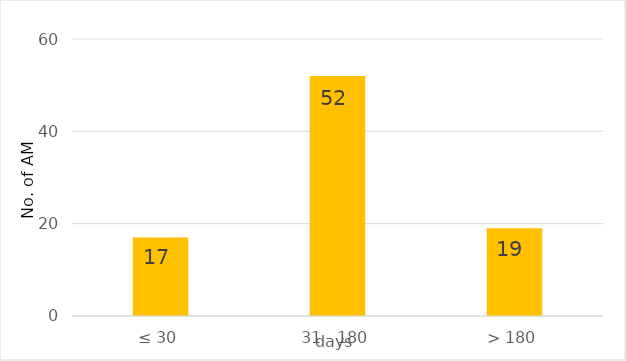
| Category | Series 0 |
|---|---|
| 0 | 17 |
| 1 | 52 |
| 2 | 19 |